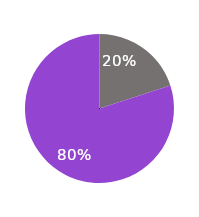
| Category | Total |
|---|---|
| NO | 6 |
| YES | 24 |